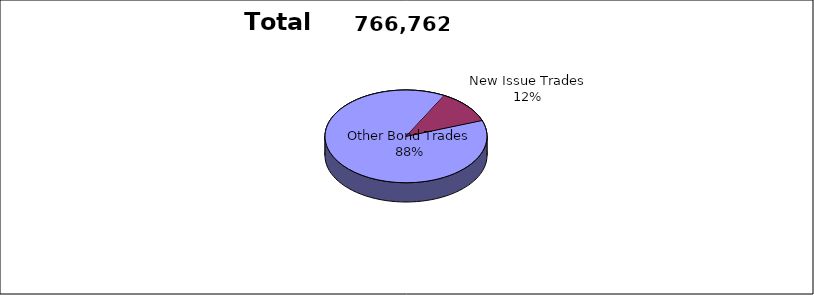
| Category | Series 0 |
|---|---|
| Other Bond Trades | 677452 |
| New Issue Trades | 89310 |